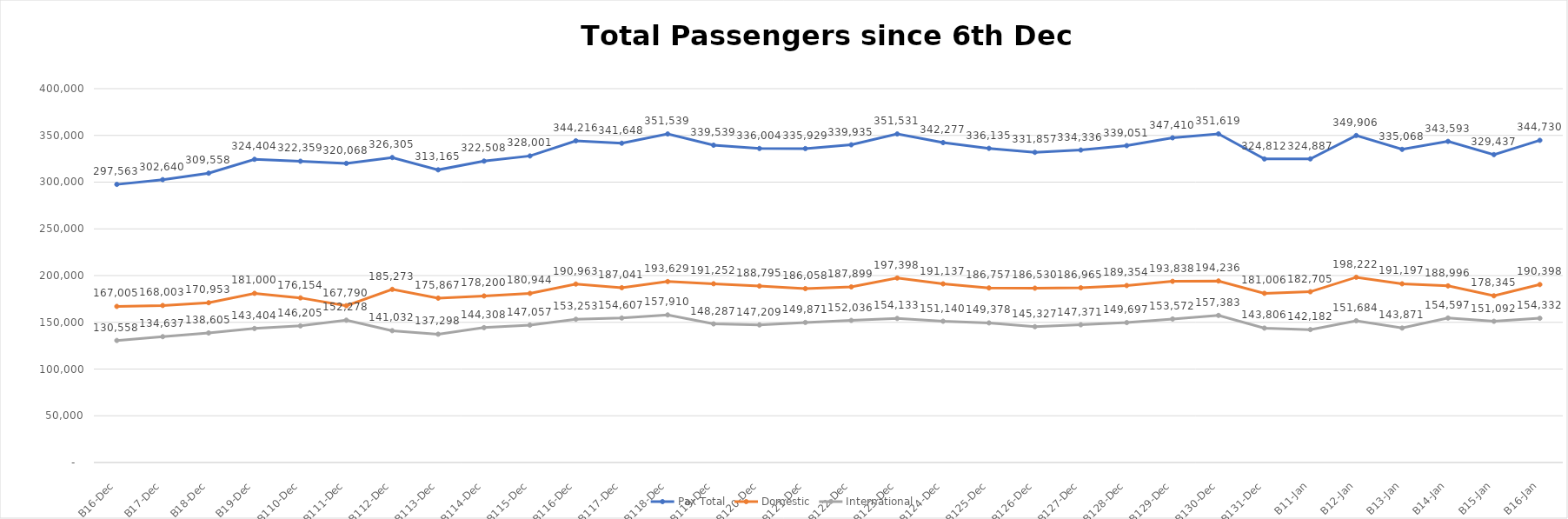
| Category | Pax Total |  Domestic  |  International  |
|---|---|---|---|
| 2022-12-06 | 297563 | 167005 | 130558 |
| 2022-12-07 | 302640 | 168003 | 134637 |
| 2022-12-08 | 309558 | 170953 | 138605 |
| 2022-12-09 | 324404 | 181000 | 143404 |
| 2022-12-10 | 322359 | 176154 | 146205 |
| 2022-12-11 | 320068 | 167790 | 152278 |
| 2022-12-12 | 326305 | 185273 | 141032 |
| 2022-12-13 | 313165 | 175867 | 137298 |
| 2022-12-14 | 322508 | 178200 | 144308 |
| 2022-12-15 | 328001 | 180944 | 147057 |
| 2022-12-16 | 344216 | 190963 | 153253 |
| 2022-12-17 | 341648 | 187041 | 154607 |
| 2022-12-18 | 351539 | 193629 | 157910 |
| 2022-12-19 | 339539 | 191252 | 148287 |
| 2022-12-20 | 336004 | 188795 | 147209 |
| 2022-12-21 | 335929 | 186058 | 149871 |
| 2022-12-22 | 339935 | 187899 | 152036 |
| 2022-12-23 | 351531 | 197398 | 154133 |
| 2022-12-24 | 342277 | 191137 | 151140 |
| 2022-12-25 | 336135 | 186757 | 149378 |
| 2022-12-26 | 331857 | 186530 | 145327 |
| 2022-12-27 | 334336 | 186965 | 147371 |
| 2022-12-28 | 339051 | 189354 | 149697 |
| 2022-12-29 | 347410 | 193838 | 153572 |
| 2022-12-30 | 351619 | 194236 | 157383 |
| 2022-12-31 | 324812 | 181006 | 143806 |
| 2023-01-01 | 324887 | 182705 | 142182 |
| 2023-01-02 | 349906 | 198222 | 151684 |
| 2023-01-03 | 335068 | 191197 | 143871 |
| 2023-01-04 | 343593 | 188996 | 154597 |
| 2023-01-05 | 329437 | 178345 | 151092 |
| 2023-01-06 | 344730 | 190398 | 154332 |